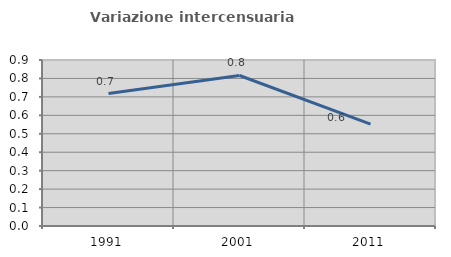
| Category | Variazione intercensuaria annua |
|---|---|
| 1991.0 | 0.718 |
| 2001.0 | 0.816 |
| 2011.0 | 0.552 |